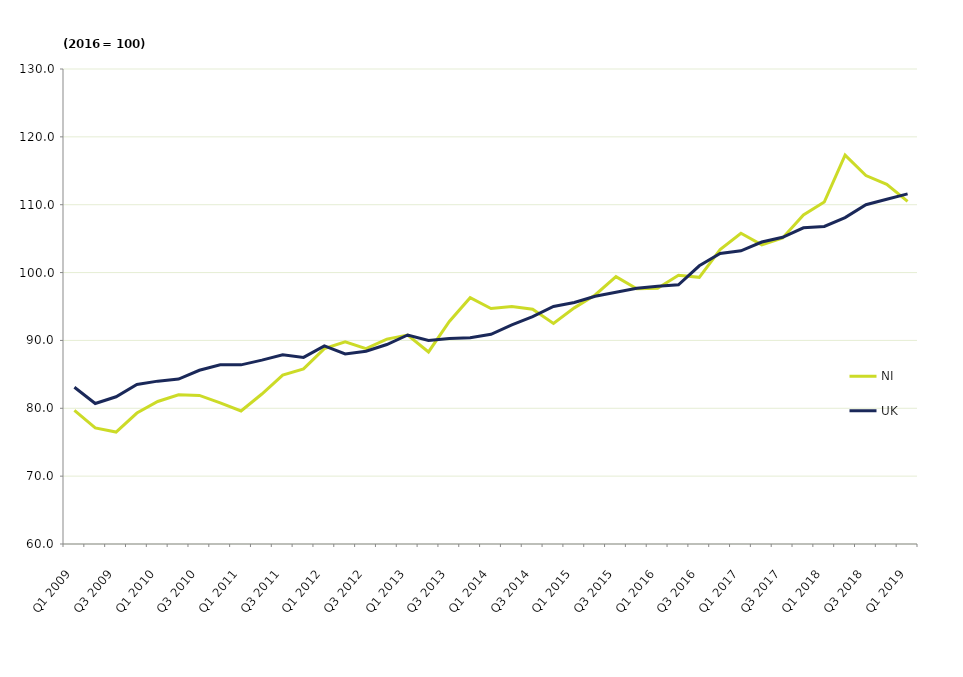
| Category | NI | UK |
|---|---|---|
| Q1 2009 | 79.7 | 83.1 |
| Q2 2009 | 77.1 | 80.7 |
| Q3 2009 | 76.5 | 81.7 |
| Q4 2009 | 79.3 | 83.5 |
| Q1 2010 | 81 | 84 |
| Q2 2010 | 82 | 84.3 |
| Q3 2010 | 81.9 | 85.6 |
| Q4 2010 | 80.8 | 86.4 |
| Q1 2011 | 79.6 | 86.4 |
| Q2 2011 | 82.1 | 87.1 |
| Q3 2011 | 84.9 | 87.9 |
| Q4 2011 | 85.8 | 87.5 |
| Q1 2012 | 88.8 | 89.2 |
| Q2 2012 | 89.8 | 88 |
| Q3 2012 | 88.8 | 88.4 |
| Q4 2012 | 90.2 | 89.4 |
| Q1 2013 | 90.8 | 90.8 |
| Q2 2013 | 88.3 | 90 |
| Q3 2013 | 92.8 | 90.3 |
| Q4 2013 | 96.3 | 90.4 |
| Q1 2014 | 94.7 | 90.9 |
| Q2 2014 | 95 | 92.3 |
| Q3 2014 | 94.6 | 93.5 |
| Q4 2014 | 92.5 | 95 |
| Q1 2015 | 94.8 | 95.6 |
| Q2 2015 | 96.7 | 96.5 |
| Q3 2015 | 99.4 | 97.1 |
| Q4 2015 | 97.6 | 97.7 |
| Q1 2016 | 97.7 | 98 |
| Q2 2016 | 99.6 | 98.2 |
| Q3 2016 | 99.3 | 101 |
| Q4 2016 | 103.4 | 102.8 |
| Q1 2017 | 105.8 | 103.2 |
| Q2 2017 | 104.1 | 104.5 |
| Q3 2017 | 105.1 | 105.2 |
| Q4 2017 | 108.5 | 106.6 |
| Q1 2018 | 110.4 | 106.8 |
| Q2 2018 | 117.3 | 108.1 |
| Q3 2018 | 114.3 | 110 |
| Q4 2018 | 113 | 110.8 |
| Q1 2019 | 110.5 | 111.6 |